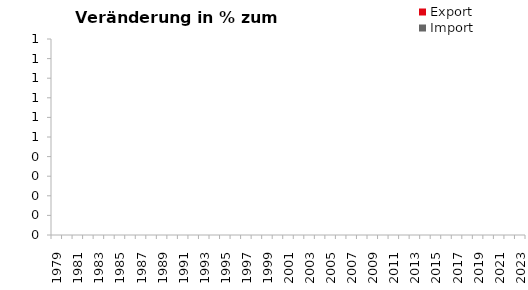
| Category | Export | Import |
|---|---|---|
| 1979.0 | 21.897 | 13.69 |
| 1980.0 | 11.643 | 12.835 |
| 1981.0 | 5.097 | 0.852 |
| 1982.0 | 6.755 | 3.805 |
| 1983.0 | 9.045 | 7.152 |
| 1984.0 | 9.139 | 8.258 |
| 1985.0 | 14.463 | 12.681 |
| 1986.0 | 5.181 | 1.745 |
| 1987.0 | 6.357 | 1.387 |
| 1988.0 | 12.547 | 10.438 |
| 1989.0 | 10.383 | 11.733 |
| 1990.0 | 15.43 | 8.261 |
| 1991.0 | 9.332 | 4.763 |
| 1992.0 | 3.817 | -0.004 |
| 1993.0 | -6.122 | -8.028 |
| 1994.0 | 7.164 | 7.498 |
| 1995.0 | 13.91 | 15.67 |
| 1996.0 | 2.952 | 4.93 |
| 1997.0 | 9.523 | 7.777 |
| 1998.0 | 11.041 | 6.85 |
| 1999.0 | 4.01 | 7.068 |
| 2000.0 | 10.398 | 11.52 |
| 2001.0 | 3.941 | 4.477 |
| 2002.0 | 2.565 | -2.557 |
| 2003.0 | 1.254 | 6.77 |
| 2004.0 | 15.387 | 17.898 |
| 2005.0 | 3.996 | 4.095 |
| 2006.0 | 4.54 | 6.214 |
| 2007.0 | 9.44 | 9.787 |
| 2008.0 | 1.635 | 2.089 |
| 2009.0 | -16.654 | -17.865 |
| 2010.0 | 18.337 | 12.615 |
| 2011.0 | 10.172 | 11.592 |
| 2012.0 | -0.523 | -0.926 |
| 2013.0 | 0.08 | -1.143 |
| 2014.0 | 0.551 | -0.973 |
| 2015.0 | 3.663 | 1.443 |
| 2016.0 | 1.464 | 2.376 |
| 2017.0 | 7.014 | 7.905 |
| 2018.0 | 5.531 | 2.667 |
| 2019.0 | -0.447 | -1.118 |
| 2020.0 | -3.558 | -8.531 |
| 2021.0 | 14.954 | 17.095 |
| 2022.0 | 16.198 | 16.689 |
| 2023.0 | 0.847 | -7.496 |